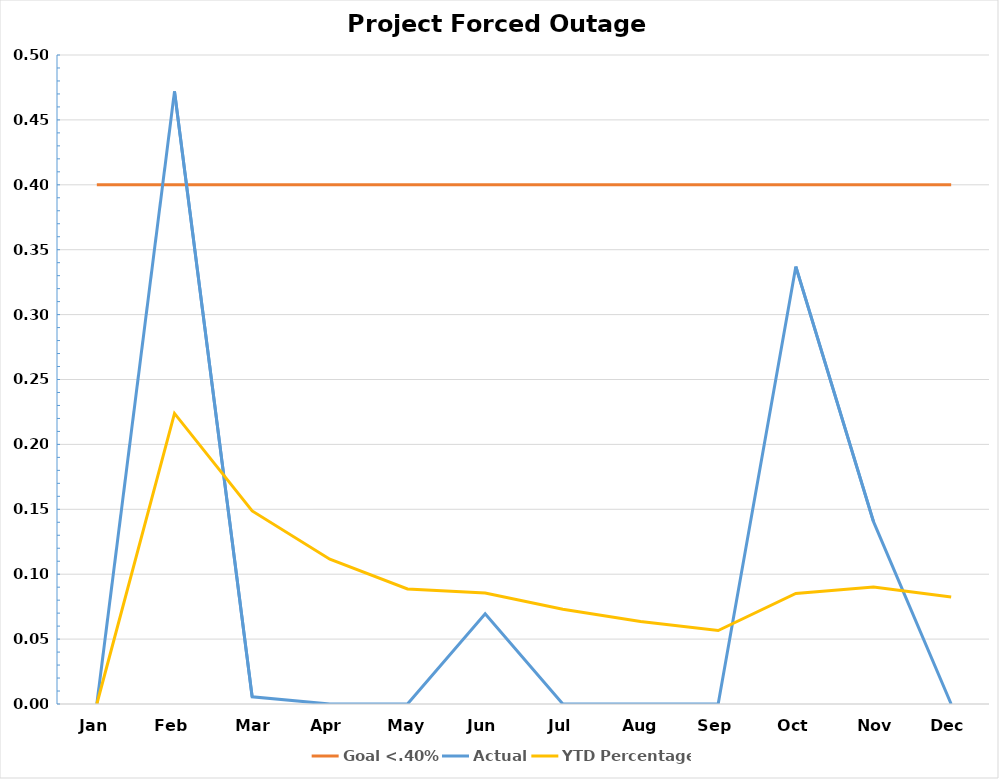
| Category | Goal <.40% | Actual | YTD Percentage |
|---|---|---|---|
| Jan | 0.4 | 0 | 0 |
| Feb | 0.4 | 0.472 | 0.224 |
| Mar | 0.4 | 0.006 | 0.149 |
| Apr | 0.4 | 0 | 0.112 |
| May | 0.4 | 0 | 0.089 |
| Jun | 0.4 | 0.07 | 0.085 |
| Jul | 0.4 | 0 | 0.073 |
| Aug | 0.4 | 0 | 0.064 |
| Sep | 0.4 | 0 | 0.057 |
| Oct | 0.4 | 0.337 | 0.085 |
| Nov | 0.4 | 0.14 | 0.09 |
| Dec | 0.4 | 0 | 0.082 |